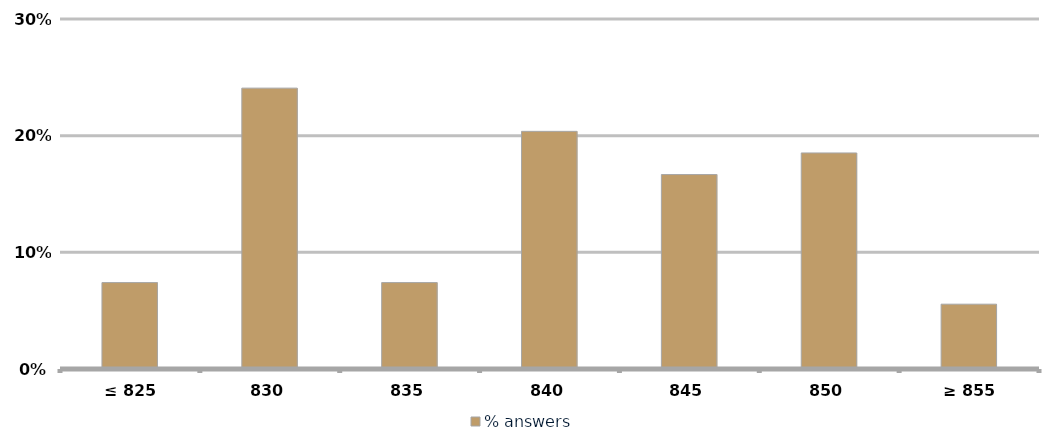
| Category | % answers |
|---|---|
| ≤ 825 | 0.074 |
| 830 | 0.241 |
| 835 | 0.074 |
| 840 | 0.204 |
| 845 | 0.167 |
| 850 | 0.185 |
| ≥ 855 | 0.056 |